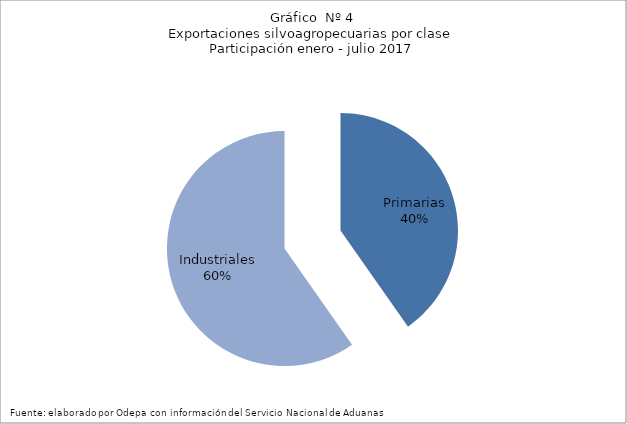
| Category | Series 0 |
|---|---|
| Primarias | 3876478 |
| Industriales | 5753378 |